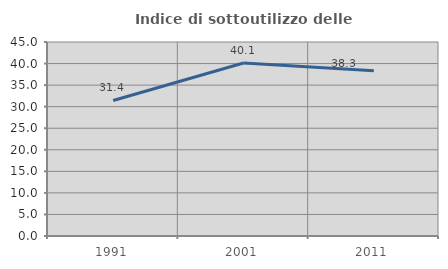
| Category | Indice di sottoutilizzo delle abitazioni  |
|---|---|
| 1991.0 | 31.436 |
| 2001.0 | 40.113 |
| 2011.0 | 38.315 |